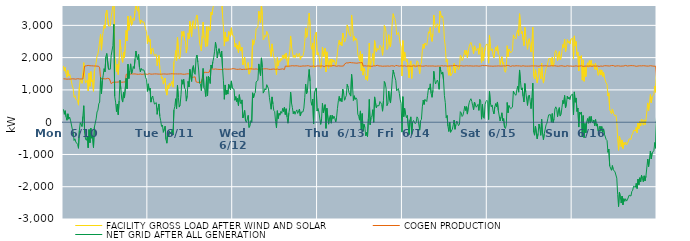
| Category | FACILITY GROSS LOAD AFTER WIND AND SOLAR | COGEN PRODUCTION | NET GRID AFTER ALL GENERATION |
|---|---|---|---|
|  Mon  6/10 | 1743 | 1344 | 399 |
|  Mon  6/10 | 1581 | 1337 | 244 |
|  Mon  6/10 | 1695 | 1340 | 355 |
|  Mon  6/10 | 1509 | 1345 | 164 |
|  Mon  6/10 | 1393 | 1333 | 60 |
|  Mon  6/10 | 1607 | 1347 | 260 |
|  Mon  6/10 | 1430 | 1336 | 94 |
|  Mon  6/10 | 1490 | 1333 | 157 |
|  Mon  6/10 | 1397 | 1335 | 62 |
|  Mon  6/10 | 1406 | 1343 | 63 |
|  Mon  6/10 | 1129 | 1344 | -215 |
|  Mon  6/10 | 1046 | 1338 | -292 |
|  Mon  6/10 | 771 | 1340 | -569 |
|  Mon  6/10 | 820 | 1335 | -515 |
|  Mon  6/10 | 718 | 1333 | -615 |
|  Mon  6/10 | 699 | 1342 | -643 |
|  Mon  6/10 | 663 | 1348 | -685 |
|  Mon  6/10 | 528 | 1337 | -809 |
|  Mon  6/10 | 1085 | 1340 | -255 |
|  Mon  6/10 | 1327 | 1341 | -14 |
|  Mon  6/10 | 1304 | 1339 | -35 |
|  Mon  6/10 | 1204 | 1339 | -135 |
|  Mon  6/10 | 1519 | 1339 | 180 |
|  Mon  6/10 | 1844 | 1334 | 510 |
|  Mon  6/10 | 1407 | 1738 | -331 |
|  Mon  6/10 | 1212 | 1740 | -528 |
|  Mon  6/10 | 1185 | 1747 | -562 |
|  Mon  6/10 | 1310 | 1741 | -431 |
|  Mon  6/10 | 966 | 1759 | -793 |
|  Mon  6/10 | 1524 | 1751 | -227 |
|  Mon  6/10 | 1111 | 1748 | -637 |
|  Mon  6/10 | 1568 | 1756 | -188 |
|  Mon  6/10 | 1251 | 1747 | -496 |
|  Mon  6/10 | 1310 | 1739 | -429 |
|  Mon  6/10 | 957 | 1743 | -786 |
|  Mon  6/10 | 1584 | 1738 | -154 |
|  Mon  6/10 | 1602 | 1740 | -138 |
|  Mon  6/10 | 1851 | 1749 | 102 |
|  Mon  6/10 | 2053 | 1737 | 316 |
|  Mon  6/10 | 2113 | 1739 | 374 |
|  Mon  6/10 | 2300 | 1730 | 570 |
|  Mon  6/10 | 2307 | 1683 | 624 |
|  Mon  6/10 | 2730 | 1346 | 1384 |
|  Mon  6/10 | 2231 | 1348 | 883 |
|  Mon  6/10 | 2627 | 1351 | 1276 |
|  Mon  6/10 | 2800 | 1343 | 1457 |
|  Mon  6/10 | 3002 | 1344 | 1658 |
|  Mon  6/10 | 2909 | 1346 | 1563 |
|  Mon  6/10 | 3368 | 1342 | 2026 |
|  Mon  6/10 | 3476 | 1347 | 2129 |
|  Mon  6/10 | 3496 | 1359 | 2137 |
|  Mon  6/10 | 2982 | 1343 | 1639 |
|  Mon  6/10 | 2984 | 1345 | 1639 |
|  Mon  6/10 | 2983 | 1340 | 1643 |
|  Mon  6/10 | 3257 | 1192 | 2065 |
|  Mon  6/10 | 3230 | 1183 | 2047 |
|  Mon  6/10 | 3615 | 1237 | 2378 |
|  Mon  6/10 | 4278 | 1244 | 3034 |
|  Mon  6/10 | 2042 | 1241 | 801 |
|  Mon  6/10 | 1866 | 1244 | 622 |
|  Mon  6/10 | 1567 | 1240 | 327 |
|  Mon  6/10 | 1799 | 1236 | 563 |
|  Mon  6/10 | 1475 | 1244 | 231 |
|  Mon  6/10 | 1906 | 1244 | 662 |
|  Mon  6/10 | 2555 | 1255 | 1300 |
|  Mon  6/10 | 2261 | 1244 | 1017 |
|  Mon  6/10 | 1950 | 1236 | 714 |
|  Mon  6/10 | 1854 | 1231 | 623 |
|  Mon  6/10 | 2165 | 1244 | 921 |
|  Mon  6/10 | 1989 | 1241 | 748 |
|  Mon  6/10 | 1975 | 1246 | 729 |
|  Mon  6/10 | 2842 | 1484 | 1358 |
|  Mon  6/10 | 2519 | 1486 | 1033 |
|  Mon  6/10 | 3290 | 1493 | 1797 |
|  Mon  6/10 | 2848 | 1498 | 1350 |
|  Mon  6/10 | 3084 | 1490 | 1594 |
|  Mon  6/10 | 3294 | 1486 | 1808 |
|  Mon  6/10 | 3003 | 1496 | 1507 |
|  Mon  6/10 | 3047 | 1477 | 1570 |
|  Mon  6/10 | 3220 | 1494 | 1726 |
|  Mon  6/10 | 3155 | 1492 | 1663 |
|  Mon  6/10 | 3449 | 1496 | 1953 |
|  Mon  6/10 | 3697 | 1491 | 2206 |
|  Mon  6/10 | 3503 | 1487 | 2016 |
|  Mon  6/10 | 3438 | 1498 | 1940 |
|  Mon  6/10 | 3581 | 1484 | 2097 |
|  Mon  6/10 | 3191 | 1494 | 1697 |
|  Mon  6/10 | 3052 | 1492 | 1560 |
|  Mon  6/10 | 3171 | 1508 | 1663 |
|  Mon  6/10 | 3099 | 1481 | 1618 |
|  Mon  6/10 | 3112 | 1490 | 1622 |
|  Mon  6/10 | 3109 | 1491 | 1618 |
|  Mon  6/10 | 3019 | 1491 | 1528 |
|  Mon  6/10 | 2870 | 1492 | 1378 |
|  Mon  6/10 | 2809 | 1480 | 1329 |
|  Mon  6/10 | 2434 | 1482 | 952 |
|  Tue  6/11 | 2679 | 1491 | 1188 |
|  Tue  6/11 | 2490 | 1503 | 987 |
|  Tue  6/11 | 2560 | 1501 | 1059 |
|  Tue  6/11 | 2109 | 1488 | 621 |
|  Tue  6/11 | 2267 | 1507 | 760 |
|  Tue  6/11 | 2301 | 1490 | 811 |
|  Tue  6/11 | 2158 | 1494 | 664 |
|  Tue  6/11 | 2056 | 1496 | 560 |
|  Tue  6/11 | 2084 | 1507 | 577 |
|  Tue  6/11 | 2102 | 1496 | 606 |
|  Tue  6/11 | 1750 | 1507 | 243 |
|  Tue  6/11 | 1935 | 1491 | 444 |
|  Tue  6/11 | 2069 | 1504 | 565 |
|  Tue  6/11 | 1674 | 1489 | 185 |
|  Tue  6/11 | 1534 | 1484 | 50 |
|  Tue  6/11 | 1357 | 1488 | -131 |
|  Tue  6/11 | 1402 | 1491 | -89 |
|  Tue  6/11 | 1180 | 1494 | -314 |
|  Tue  6/11 | 1280 | 1493 | -213 |
|  Tue  6/11 | 1369 | 1493 | -124 |
|  Tue  6/11 | 964 | 1501 | -537 |
|  Tue  6/11 | 837 | 1488 | -651 |
|  Tue  6/11 | 1141 | 1478 | -337 |
|  Tue  6/11 | 1042 | 1492 | -450 |
|  Tue  6/11 | 1214 | 1498 | -284 |
|  Tue  6/11 | 1131 | 1496 | -365 |
|  Tue  6/11 | 1149 | 1483 | -334 |
|  Tue  6/11 | 1269 | 1500 | -231 |
|  Tue  6/11 | 1086 | 1485 | -399 |
|  Tue  6/11 | 1871 | 1495 | 376 |
|  Tue  6/11 | 1978 | 1494 | 484 |
|  Tue  6/11 | 2223 | 1496 | 727 |
|  Tue  6/11 | 1897 | 1476 | 421 |
|  Tue  6/11 | 2637 | 1494 | 1143 |
|  Tue  6/11 | 2260 | 1487 | 773 |
|  Tue  6/11 | 1963 | 1495 | 468 |
|  Tue  6/11 | 2040 | 1499 | 541 |
|  Tue  6/11 | 2347 | 1497 | 850 |
|  Tue  6/11 | 2812 | 1496 | 1316 |
|  Tue  6/11 | 2664 | 1487 | 1177 |
|  Tue  6/11 | 2818 | 1489 | 1329 |
|  Tue  6/11 | 2546 | 1484 | 1062 |
|  Tue  6/11 | 2510 | 1492 | 1018 |
|  Tue  6/11 | 2146 | 1494 | 652 |
|  Tue  6/11 | 2327 | 1501 | 826 |
|  Tue  6/11 | 2764 | 1500 | 1264 |
|  Tue  6/11 | 2584 | 1492 | 1092 |
|  Tue  6/11 | 3130 | 1492 | 1638 |
|  Tue  6/11 | 3151 | 1493 | 1658 |
|  Tue  6/11 | 2653 | 1388 | 1265 |
|  Tue  6/11 | 3082 | 1405 | 1677 |
|  Tue  6/11 | 3147 | 1394 | 1753 |
|  Tue  6/11 | 2934 | 1400 | 1534 |
|  Tue  6/11 | 2887 | 1405 | 1482 |
|  Tue  6/11 | 3229 | 1250 | 1979 |
|  Tue  6/11 | 3322 | 1241 | 2081 |
|  Tue  6/11 | 3097 | 1233 | 1864 |
|  Tue  6/11 | 2854 | 1239 | 1615 |
|  Tue  6/11 | 2448 | 1237 | 1211 |
|  Tue  6/11 | 2423 | 1244 | 1179 |
|  Tue  6/11 | 2214 | 1237 | 977 |
|  Tue  6/11 | 2678 | 1346 | 1332 |
|  Tue  6/11 | 3103 | 1437 | 1666 |
|  Tue  6/11 | 2611 | 1545 | 1066 |
|  Tue  6/11 | 2546 | 1545 | 1001 |
|  Tue  6/11 | 2338 | 1544 | 794 |
|  Tue  6/11 | 2960 | 1554 | 1406 |
|  Tue  6/11 | 2357 | 1541 | 816 |
|  Tue  6/11 | 2959 | 1537 | 1422 |
|  Tue  6/11 | 2913 | 1550 | 1363 |
|  Tue  6/11 | 2839 | 1641 | 1198 |
|  Tue  6/11 | 3406 | 1635 | 1771 |
|  Tue  6/11 | 3328 | 1654 | 1674 |
|  Tue  6/11 | 3519 | 1647 | 1872 |
|  Tue  6/11 | 3638 | 1641 | 1997 |
|  Tue  6/11 | 3840 | 1641 | 2199 |
|  Tue  6/11 | 4129 | 1649 | 2480 |
|  Tue  6/11 | 3925 | 1638 | 2287 |
|  Tue  6/11 | 3629 | 1640 | 1989 |
|  Tue  6/11 | 3836 | 1642 | 2194 |
|  Tue  6/11 | 3915 | 1636 | 2279 |
|  Tue  6/11 | 3778 | 1642 | 2136 |
|  Tue  6/11 | 3650 | 1634 | 2016 |
|  Tue  6/11 | 3833 | 1630 | 2203 |
|  Tue  6/11 | 3303 | 1635 | 1668 |
|  Tue  6/11 | 2931 | 1649 | 1282 |
|  Tue  6/11 | 2358 | 1649 | 709 |
|  Tue  6/11 | 2795 | 1641 | 1154 |
|  Tue  6/11 | 2500 | 1643 | 857 |
|  Tue  6/11 | 2630 | 1641 | 989 |
|  Tue  6/11 | 2511 | 1641 | 870 |
|  Tue  6/11 | 2809 | 1639 | 1170 |
|  Tue  6/11 | 2829 | 1642 | 1187 |
|  Tue  6/11 | 2664 | 1654 | 1010 |
|  Tue  6/11 | 2926 | 1647 | 1279 |
|  Tue  6/11 | 2699 | 1647 | 1052 |
|  Wed  6/12 | 2701 | 1661 | 1040 |
|  Wed  6/12 | 2656 | 1636 | 1020 |
|  Wed  6/12 | 2328 | 1650 | 678 |
|  Wed  6/12 | 2438 | 1645 | 793 |
|  Wed  6/12 | 2276 | 1638 | 638 |
|  Wed  6/12 | 2387 | 1651 | 736 |
|  Wed  6/12 | 2153 | 1638 | 515 |
|  Wed  6/12 | 2496 | 1645 | 851 |
|  Wed  6/12 | 2284 | 1648 | 636 |
|  Wed  6/12 | 2201 | 1636 | 565 |
|  Wed  6/12 | 2323 | 1632 | 691 |
|  Wed  6/12 | 1777 | 1645 | 132 |
|  Wed  6/12 | 1875 | 1640 | 235 |
|  Wed  6/12 | 2016 | 1651 | 365 |
|  Wed  6/12 | 1680 | 1640 | 40 |
|  Wed  6/12 | 1632 | 1635 | -3 |
|  Wed  6/12 | 1745 | 1644 | 101 |
|  Wed  6/12 | 1848 | 1638 | 210 |
|  Wed  6/12 | 1486 | 1651 | -165 |
|  Wed  6/12 | 1537 | 1655 | -118 |
|  Wed  6/12 | 1701 | 1653 | 48 |
|  Wed  6/12 | 1639 | 1644 | -5 |
|  Wed  6/12 | 2557 | 1647 | 910 |
|  Wed  6/12 | 2388 | 1639 | 749 |
|  Wed  6/12 | 2522 | 1644 | 878 |
|  Wed  6/12 | 2564 | 1652 | 912 |
|  Wed  6/12 | 2896 | 1651 | 1245 |
|  Wed  6/12 | 2904 | 1649 | 1255 |
|  Wed  6/12 | 2940 | 1639 | 1301 |
|  Wed  6/12 | 3442 | 1637 | 1805 |
|  Wed  6/12 | 3421 | 1644 | 1777 |
|  Wed  6/12 | 3090 | 1645 | 1445 |
|  Wed  6/12 | 3634 | 1641 | 1993 |
|  Wed  6/12 | 3333 | 1634 | 1699 |
|  Wed  6/12 | 2551 | 1650 | 901 |
|  Wed  6/12 | 2599 | 1639 | 960 |
|  Wed  6/12 | 2694 | 1654 | 1040 |
|  Wed  6/12 | 2649 | 1651 | 998 |
|  Wed  6/12 | 2817 | 1654 | 1163 |
|  Wed  6/12 | 2824 | 1644 | 1180 |
|  Wed  6/12 | 2679 | 1643 | 1036 |
|  Wed  6/12 | 2399 | 1630 | 769 |
|  Wed  6/12 | 2410 | 1635 | 775 |
|  Wed  6/12 | 2031 | 1630 | 401 |
|  Wed  6/12 | 2426 | 1643 | 783 |
|  Wed  6/12 | 2200 | 1636 | 564 |
|  Wed  6/12 | 2008 | 1646 | 362 |
|  Wed  6/12 | 1966 | 1638 | 328 |
|  Wed  6/12 | 1653 | 1639 | 14 |
|  Wed  6/12 | 1469 | 1649 | -180 |
|  Wed  6/12 | 2003 | 1647 | 356 |
|  Wed  6/12 | 1745 | 1634 | 111 |
|  Wed  6/12 | 1909 | 1633 | 276 |
|  Wed  6/12 | 1862 | 1645 | 217 |
|  Wed  6/12 | 1979 | 1643 | 336 |
|  Wed  6/12 | 1917 | 1642 | 275 |
|  Wed  6/12 | 2076 | 1652 | 424 |
|  Wed  6/12 | 1980 | 1648 | 332 |
|  Wed  6/12 | 2093 | 1631 | 462 |
|  Wed  6/12 | 1973 | 1737 | 236 |
|  Wed  6/12 | 2142 | 1726 | 416 |
|  Wed  6/12 | 1896 | 1735 | 161 |
|  Wed  6/12 | 1706 | 1738 | -32 |
|  Wed  6/12 | 2018 | 1736 | 282 |
|  Wed  6/12 | 2194 | 1752 | 442 |
|  Wed  6/12 | 2671 | 1742 | 929 |
|  Wed  6/12 | 2333 | 1737 | 596 |
|  Wed  6/12 | 2201 | 1750 | 451 |
|  Wed  6/12 | 2009 | 1746 | 263 |
|  Wed  6/12 | 2081 | 1743 | 338 |
|  Wed  6/12 | 1995 | 1750 | 245 |
|  Wed  6/12 | 2077 | 1748 | 329 |
|  Wed  6/12 | 2131 | 1750 | 381 |
|  Wed  6/12 | 2016 | 1744 | 272 |
|  Wed  6/12 | 1989 | 1734 | 255 |
|  Wed  6/12 | 2141 | 1733 | 408 |
|  Wed  6/12 | 1942 | 1751 | 191 |
|  Wed  6/12 | 2048 | 1734 | 314 |
|  Wed  6/12 | 2017 | 1732 | 285 |
|  Wed  6/12 | 2061 | 1743 | 318 |
|  Wed  6/12 | 2175 | 1738 | 437 |
|  Wed  6/12 | 2498 | 1740 | 758 |
|  Wed  6/12 | 2919 | 1739 | 1180 |
|  Wed  6/12 | 2623 | 1746 | 877 |
|  Wed  6/12 | 2716 | 1747 | 969 |
|  Wed  6/12 | 3119 | 1751 | 1368 |
|  Wed  6/12 | 3382 | 1749 | 1633 |
|  Wed  6/12 | 2997 | 1733 | 1264 |
|  Wed  6/12 | 2362 | 1726 | 636 |
|  Wed  6/12 | 2259 | 1734 | 525 |
|  Wed  6/12 | 2455 | 1737 | 718 |
|  Wed  6/12 | 1686 | 1742 | -56 |
|  Wed  6/12 | 2660 | 1738 | 922 |
|  Wed  6/12 | 2667 | 1727 | 940 |
|  Wed  6/12 | 2790 | 1729 | 1061 |
|  Wed  6/12 | 2090 | 1745 | 345 |
|  Thu  6/13 | 2158 | 1736 | 422 |
|  Thu  6/13 | 2056 | 1740 | 316 |
|  Thu  6/13 | 2034 | 1748 | 286 |
|  Thu  6/13 | 1671 | 1739 | -68 |
|  Thu  6/13 | 1836 | 1734 | 102 |
|  Thu  6/13 | 2327 | 1744 | 583 |
|  Thu  6/13 | 2034 | 1741 | 293 |
|  Thu  6/13 | 2018 | 1723 | 295 |
|  Thu  6/13 | 2288 | 1745 | 543 |
|  Thu  6/13 | 1558 | 1749 | -191 |
|  Thu  6/13 | 2180 | 1745 | 435 |
|  Thu  6/13 | 2159 | 1743 | 416 |
|  Thu  6/13 | 1673 | 1734 | -61 |
|  Thu  6/13 | 1881 | 1740 | 141 |
|  Thu  6/13 | 1950 | 1740 | 210 |
|  Thu  6/13 | 1710 | 1741 | -31 |
|  Thu  6/13 | 1956 | 1743 | 213 |
|  Thu  6/13 | 1861 | 1753 | 108 |
|  Thu  6/13 | 1928 | 1739 | 189 |
|  Thu  6/13 | 1862 | 1749 | 113 |
|  Thu  6/13 | 1754 | 1747 | 7 |
|  Thu  6/13 | 1882 | 1732 | 150 |
|  Thu  6/13 | 2176 | 1747 | 429 |
|  Thu  6/13 | 2410 | 1747 | 663 |
|  Thu  6/13 | 2539 | 1740 | 799 |
|  Thu  6/13 | 2390 | 1739 | 651 |
|  Thu  6/13 | 2484 | 1743 | 741 |
|  Thu  6/13 | 2371 | 1737 | 634 |
|  Thu  6/13 | 2763 | 1743 | 1020 |
|  Thu  6/13 | 2626 | 1743 | 883 |
|  Thu  6/13 | 2482 | 1801 | 681 |
|  Thu  6/13 | 2565 | 1797 | 768 |
|  Thu  6/13 | 2658 | 1838 | 820 |
|  Thu  6/13 | 3013 | 1841 | 1172 |
|  Thu  6/13 | 2921 | 1835 | 1086 |
|  Thu  6/13 | 2760 | 1842 | 918 |
|  Thu  6/13 | 2763 | 1851 | 912 |
|  Thu  6/13 | 2659 | 1851 | 808 |
|  Thu  6/13 | 3322 | 1842 | 1480 |
|  Thu  6/13 | 3009 | 1854 | 1155 |
|  Thu  6/13 | 2510 | 1839 | 671 |
|  Thu  6/13 | 2660 | 1841 | 819 |
|  Thu  6/13 | 2536 | 1832 | 704 |
|  Thu  6/13 | 2602 | 1847 | 755 |
|  Thu  6/13 | 2530 | 1828 | 702 |
|  Thu  6/13 | 2100 | 1852 | 248 |
|  Thu  6/13 | 2024 | 1838 | 186 |
|  Thu  6/13 | 1898 | 1836 | 62 |
|  Thu  6/13 | 2192 | 1843 | 349 |
|  Thu  6/13 | 1593 | 1839 | -246 |
|  Thu  6/13 | 2114 | 1847 | 267 |
|  Thu  6/13 | 1458 | 1739 | -281 |
|  Thu  6/13 | 1678 | 1744 | -66 |
|  Thu  6/13 | 1584 | 1747 | -163 |
|  Thu  6/13 | 1323 | 1747 | -424 |
|  Thu  6/13 | 1424 | 1740 | -316 |
|  Thu  6/13 | 1295 | 1741 | -446 |
|  Thu  6/13 | 1861 | 1743 | 118 |
|  Thu  6/13 | 2453 | 1747 | 706 |
|  Thu  6/13 | 1658 | 1736 | -78 |
|  Thu  6/13 | 1879 | 1731 | 148 |
|  Thu  6/13 | 1920 | 1731 | 189 |
|  Thu  6/13 | 2125 | 1738 | 387 |
|  Thu  6/13 | 1741 | 1745 | -4 |
|  Thu  6/13 | 2527 | 1744 | 783 |
|  Thu  6/13 | 2507 | 1745 | 762 |
|  Thu  6/13 | 2190 | 1744 | 446 |
|  Thu  6/13 | 2275 | 1764 | 511 |
|  Thu  6/13 | 2270 | 1752 | 518 |
|  Thu  6/13 | 2253 | 1742 | 511 |
|  Thu  6/13 | 2385 | 1745 | 640 |
|  Thu  6/13 | 2344 | 1742 | 602 |
|  Thu  6/13 | 2290 | 1744 | 546 |
|  Thu  6/13 | 2073 | 1733 | 340 |
|  Thu  6/13 | 2402 | 1743 | 659 |
|  Thu  6/13 | 2997 | 1737 | 1260 |
|  Thu  6/13 | 2925 | 1730 | 1195 |
|  Thu  6/13 | 2790 | 1737 | 1053 |
|  Thu  6/13 | 2255 | 1741 | 514 |
|  Thu  6/13 | 2324 | 1742 | 582 |
|  Thu  6/13 | 2710 | 1745 | 965 |
|  Thu  6/13 | 2415 | 1734 | 681 |
|  Thu  6/13 | 2330 | 1737 | 593 |
|  Thu  6/13 | 2681 | 1747 | 934 |
|  Thu  6/13 | 3073 | 1739 | 1334 |
|  Thu  6/13 | 3361 | 1744 | 1617 |
|  Thu  6/13 | 3248 | 1751 | 1497 |
|  Thu  6/13 | 3196 | 1729 | 1467 |
|  Thu  6/13 | 3048 | 1760 | 1288 |
|  Thu  6/13 | 2708 | 1737 | 971 |
|  Thu  6/13 | 2746 | 1749 | 997 |
|  Thu  6/13 | 2778 | 1737 | 1041 |
|  Thu  6/13 | 2627 | 1735 | 892 |
|  Thu  6/13 | 2438 | 1745 | 693 |
|  Thu  6/13 | 2334 | 1749 | 585 |
|  Thu  6/13 | 1430 | 1738 | -308 |
|  Fri  6/14 | 2528 | 1738 | 790 |
|  Fri  6/14 | 1914 | 1743 | 171 |
|  Fri  6/14 | 2176 | 1747 | 429 |
|  Fri  6/14 | 2005 | 1751 | 254 |
|  Fri  6/14 | 1871 | 1733 | 138 |
|  Fri  6/14 | 1948 | 1739 | 209 |
|  Fri  6/14 | 1922 | 1742 | 180 |
|  Fri  6/14 | 1377 | 1760 | -383 |
|  Fri  6/14 | 1801 | 1738 | 63 |
|  Fri  6/14 | 1899 | 1734 | 165 |
|  Fri  6/14 | 1356 | 1733 | -377 |
|  Fri  6/14 | 1744 | 1745 | -1 |
|  Fri  6/14 | 1802 | 1748 | 54 |
|  Fri  6/14 | 1770 | 1741 | 29 |
|  Fri  6/14 | 1690 | 1737 | -47 |
|  Fri  6/14 | 1742 | 1752 | -10 |
|  Fri  6/14 | 1903 | 1738 | 165 |
|  Fri  6/14 | 1868 | 1751 | 117 |
|  Fri  6/14 | 1851 | 1749 | 102 |
|  Fri  6/14 | 1504 | 1751 | -247 |
|  Fri  6/14 | 1787 | 1743 | 44 |
|  Fri  6/14 | 1832 | 1747 | 85 |
|  Fri  6/14 | 2210 | 1735 | 475 |
|  Fri  6/14 | 2419 | 1736 | 683 |
|  Fri  6/14 | 2286 | 1737 | 549 |
|  Fri  6/14 | 2454 | 1752 | 702 |
|  Fri  6/14 | 2447 | 1750 | 697 |
|  Fri  6/14 | 2382 | 1741 | 641 |
|  Fri  6/14 | 2573 | 1739 | 834 |
|  Fri  6/14 | 2802 | 1742 | 1060 |
|  Fri  6/14 | 2757 | 1741 | 1016 |
|  Fri  6/14 | 2936 | 1748 | 1188 |
|  Fri  6/14 | 2628 | 1740 | 888 |
|  Fri  6/14 | 2503 | 1732 | 771 |
|  Fri  6/14 | 2732 | 1743 | 989 |
|  Fri  6/14 | 3322 | 1745 | 1577 |
|  Fri  6/14 | 3057 | 1735 | 1322 |
|  Fri  6/14 | 2928 | 1745 | 1183 |
|  Fri  6/14 | 2995 | 1736 | 1259 |
|  Fri  6/14 | 3050 | 1746 | 1304 |
|  Fri  6/14 | 2964 | 1742 | 1222 |
|  Fri  6/14 | 2775 | 1756 | 1019 |
|  Fri  6/14 | 3445 | 1735 | 1710 |
|  Fri  6/14 | 3332 | 1753 | 1579 |
|  Fri  6/14 | 3240 | 1752 | 1488 |
|  Fri  6/14 | 3293 | 1737 | 1556 |
|  Fri  6/14 | 3045 | 1739 | 1306 |
|  Fri  6/14 | 2561 | 1741 | 820 |
|  Fri  6/14 | 2350 | 1746 | 604 |
|  Fri  6/14 | 1873 | 1730 | 143 |
|  Fri  6/14 | 1942 | 1737 | 205 |
|  Fri  6/14 | 1615 | 1739 | -124 |
|  Fri  6/14 | 1451 | 1740 | -289 |
|  Fri  6/14 | 1729 | 1726 | 3 |
|  Fri  6/14 | 1431 | 1745 | -314 |
|  Fri  6/14 | 1411 | 1755 | -344 |
|  Fri  6/14 | 1531 | 1745 | -214 |
|  Fri  6/14 | 1655 | 1738 | -83 |
|  Fri  6/14 | 1823 | 1756 | 67 |
|  Fri  6/14 | 1523 | 1743 | -220 |
|  Fri  6/14 | 1685 | 1758 | -73 |
|  Fri  6/14 | 1766 | 1733 | 33 |
|  Fri  6/14 | 1770 | 1738 | 32 |
|  Fri  6/14 | 1625 | 1733 | -108 |
|  Fri  6/14 | 1671 | 1740 | -69 |
|  Fri  6/14 | 2075 | 1749 | 326 |
|  Fri  6/14 | 2038 | 1750 | 288 |
|  Fri  6/14 | 1909 | 1732 | 177 |
|  Fri  6/14 | 1955 | 1739 | 216 |
|  Fri  6/14 | 2080 | 1743 | 337 |
|  Fri  6/14 | 2234 | 1741 | 493 |
|  Fri  6/14 | 2096 | 1731 | 365 |
|  Fri  6/14 | 2230 | 1749 | 481 |
|  Fri  6/14 | 1997 | 1746 | 251 |
|  Fri  6/14 | 2206 | 1742 | 464 |
|  Fri  6/14 | 2337 | 1736 | 601 |
|  Fri  6/14 | 2424 | 1745 | 679 |
|  Fri  6/14 | 2475 | 1748 | 727 |
|  Fri  6/14 | 2381 | 1741 | 640 |
|  Fri  6/14 | 2252 | 1745 | 507 |
|  Fri  6/14 | 2121 | 1737 | 384 |
|  Fri  6/14 | 2365 | 1741 | 624 |
|  Fri  6/14 | 2280 | 1743 | 537 |
|  Fri  6/14 | 2215 | 1752 | 463 |
|  Fri  6/14 | 2200 | 1743 | 457 |
|  Fri  6/14 | 2292 | 1740 | 552 |
|  Fri  6/14 | 2101 | 1736 | 365 |
|  Fri  6/14 | 2440 | 1734 | 706 |
|  Fri  6/14 | 2405 | 1742 | 663 |
|  Fri  6/14 | 1843 | 1750 | 93 |
|  Fri  6/14 | 2307 | 1757 | 550 |
|  Fri  6/14 | 1894 | 1741 | 153 |
|  Fri  6/14 | 1868 | 1750 | 118 |
|  Fri  6/14 | 2302 | 1748 | 554 |
|  Fri  6/14 | 2391 | 1754 | 637 |
|  Fri  6/14 | 2425 | 1749 | 676 |
|  Sat  6/15 | 2381 | 1744 | 637 |
|  Sat  6/15 | 1828 | 1746 | 82 |
|  Sat  6/15 | 2689 | 1739 | 950 |
|  Sat  6/15 | 2347 | 1744 | 603 |
|  Sat  6/15 | 2214 | 1738 | 476 |
|  Sat  6/15 | 2274 | 1741 | 533 |
|  Sat  6/15 | 2084 | 1734 | 350 |
|  Sat  6/15 | 1995 | 1739 | 256 |
|  Sat  6/15 | 2211 | 1739 | 472 |
|  Sat  6/15 | 2328 | 1753 | 575 |
|  Sat  6/15 | 2209 | 1739 | 470 |
|  Sat  6/15 | 2366 | 1740 | 626 |
|  Sat  6/15 | 2101 | 1744 | 357 |
|  Sat  6/15 | 2068 | 1741 | 327 |
|  Sat  6/15 | 1780 | 1740 | 40 |
|  Sat  6/15 | 1895 | 1739 | 156 |
|  Sat  6/15 | 2030 | 1739 | 291 |
|  Sat  6/15 | 1795 | 1752 | 43 |
|  Sat  6/15 | 1855 | 1744 | 111 |
|  Sat  6/15 | 1592 | 1753 | -161 |
|  Sat  6/15 | 1546 | 1741 | -195 |
|  Sat  6/15 | 1662 | 1749 | -87 |
|  Sat  6/15 | 2369 | 1759 | 610 |
|  Sat  6/15 | 2032 | 1740 | 292 |
|  Sat  6/15 | 2267 | 1750 | 517 |
|  Sat  6/15 | 2203 | 1738 | 465 |
|  Sat  6/15 | 2147 | 1728 | 419 |
|  Sat  6/15 | 2151 | 1754 | 397 |
|  Sat  6/15 | 2215 | 1748 | 467 |
|  Sat  6/15 | 2705 | 1743 | 962 |
|  Sat  6/15 | 2623 | 1739 | 884 |
|  Sat  6/15 | 2644 | 1742 | 902 |
|  Sat  6/15 | 2581 | 1748 | 833 |
|  Sat  6/15 | 2774 | 1757 | 1017 |
|  Sat  6/15 | 2859 | 1745 | 1114 |
|  Sat  6/15 | 2675 | 1745 | 930 |
|  Sat  6/15 | 3361 | 1743 | 1618 |
|  Sat  6/15 | 3047 | 1756 | 1291 |
|  Sat  6/15 | 2735 | 1735 | 1000 |
|  Sat  6/15 | 2810 | 1747 | 1063 |
|  Sat  6/15 | 2549 | 1749 | 800 |
|  Sat  6/15 | 2369 | 1744 | 625 |
|  Sat  6/15 | 2935 | 1737 | 1198 |
|  Sat  6/15 | 2678 | 1742 | 936 |
|  Sat  6/15 | 2671 | 1737 | 934 |
|  Sat  6/15 | 2259 | 1741 | 518 |
|  Sat  6/15 | 2541 | 1737 | 804 |
|  Sat  6/15 | 2593 | 1751 | 842 |
|  Sat  6/15 | 2391 | 1739 | 652 |
|  Sat  6/15 | 2173 | 1753 | 420 |
|  Sat  6/15 | 2497 | 1744 | 753 |
|  Sat  6/15 | 2947 | 1737 | 1210 |
|  Sat  6/15 | 1435 | 1743 | -308 |
|  Sat  6/15 | 1336 | 1740 | -404 |
|  Sat  6/15 | 1624 | 1744 | -120 |
|  Sat  6/15 | 1651 | 1749 | -98 |
|  Sat  6/15 | 1222 | 1738 | -516 |
|  Sat  6/15 | 1397 | 1743 | -346 |
|  Sat  6/15 | 1678 | 1734 | -56 |
|  Sat  6/15 | 1530 | 1731 | -201 |
|  Sat  6/15 | 1343 | 1751 | -408 |
|  Sat  6/15 | 1833 | 1742 | 91 |
|  Sat  6/15 | 1360 | 1742 | -382 |
|  Sat  6/15 | 1211 | 1754 | -543 |
|  Sat  6/15 | 1393 | 1745 | -352 |
|  Sat  6/15 | 1372 | 1748 | -376 |
|  Sat  6/15 | 1666 | 1748 | -82 |
|  Sat  6/15 | 1719 | 1748 | -29 |
|  Sat  6/15 | 1850 | 1738 | 112 |
|  Sat  6/15 | 1968 | 1741 | 227 |
|  Sat  6/15 | 1950 | 1740 | 210 |
|  Sat  6/15 | 1972 | 1739 | 233 |
|  Sat  6/15 | 1745 | 1748 | -3 |
|  Sat  6/15 | 2009 | 1743 | 266 |
|  Sat  6/15 | 1733 | 1745 | -12 |
|  Sat  6/15 | 1840 | 1737 | 103 |
|  Sat  6/15 | 2158 | 1748 | 410 |
|  Sat  6/15 | 2221 | 1745 | 476 |
|  Sat  6/15 | 2139 | 1738 | 401 |
|  Sat  6/15 | 1903 | 1737 | 166 |
|  Sat  6/15 | 2108 | 1734 | 374 |
|  Sat  6/15 | 2192 | 1740 | 452 |
|  Sat  6/15 | 1933 | 1744 | 189 |
|  Sat  6/15 | 1989 | 1742 | 247 |
|  Sat  6/15 | 2211 | 1748 | 463 |
|  Sat  6/15 | 2407 | 1732 | 675 |
|  Sat  6/15 | 2313 | 1735 | 578 |
|  Sat  6/15 | 2563 | 1736 | 827 |
|  Sat  6/15 | 2174 | 1731 | 443 |
|  Sat  6/15 | 2306 | 1748 | 558 |
|  Sat  6/15 | 2560 | 1750 | 810 |
|  Sat  6/15 | 2457 | 1739 | 718 |
|  Sat  6/15 | 2519 | 1737 | 782 |
|  Sat  6/15 | 2421 | 1722 | 699 |
|  Sat  6/15 | 2566 | 1740 | 826 |
|  Sat  6/15 | 2552 | 1743 | 809 |
|  Sun  6/16 | 2605 | 1733 | 872 |
|  Sun  6/16 | 1961 | 1736 | 225 |
|  Sun  6/16 | 2674 | 1736 | 938 |
|  Sun  6/16 | 2359 | 1741 | 618 |
|  Sun  6/16 | 2497 | 1746 | 751 |
|  Sun  6/16 | 2075 | 1744 | 331 |
|  Sun  6/16 | 2171 | 1733 | 438 |
|  Sun  6/16 | 1591 | 1742 | -151 |
|  Sun  6/16 | 2050 | 1739 | 311 |
|  Sun  6/16 | 1981 | 1734 | 247 |
|  Sun  6/16 | 2063 | 1747 | 316 |
|  Sun  6/16 | 1304 | 1759 | -455 |
|  Sun  6/16 | 1933 | 1727 | 206 |
|  Sun  6/16 | 1267 | 1744 | -477 |
|  Sun  6/16 | 1699 | 1738 | -39 |
|  Sun  6/16 | 1415 | 1745 | -330 |
|  Sun  6/16 | 1747 | 1737 | 10 |
|  Sun  6/16 | 1838 | 1725 | 113 |
|  Sun  6/16 | 1705 | 1737 | -32 |
|  Sun  6/16 | 1905 | 1736 | 169 |
|  Sun  6/16 | 1715 | 1742 | -27 |
|  Sun  6/16 | 1913 | 1735 | 178 |
|  Sun  6/16 | 1741 | 1730 | 11 |
|  Sun  6/16 | 1719 | 1743 | -24 |
|  Sun  6/16 | 1809 | 1742 | 67 |
|  Sun  6/16 | 1638 | 1750 | -112 |
|  Sun  6/16 | 1819 | 1737 | 82 |
|  Sun  6/16 | 1616 | 1737 | -121 |
|  Sun  6/16 | 1688 | 1741 | -53 |
|  Sun  6/16 | 1452 | 1731 | -279 |
|  Sun  6/16 | 1497 | 1729 | -232 |
|  Sun  6/16 | 1633 | 1755 | -122 |
|  Sun  6/16 | 1459 | 1740 | -281 |
|  Sun  6/16 | 1612 | 1747 | -135 |
|  Sun  6/16 | 1419 | 1733 | -314 |
|  Sun  6/16 | 1548 | 1755 | -207 |
|  Sun  6/16 | 1379 | 1749 | -370 |
|  Sun  6/16 | 1382 | 1751 | -369 |
|  Sun  6/16 | 1213 | 1749 | -536 |
|  Sun  6/16 | 1165 | 1737 | -572 |
|  Sun  6/16 | 810 | 1743 | -933 |
|  Sun  6/16 | 908 | 1742 | -834 |
|  Sun  6/16 | 383 | 1740 | -1357 |
|  Sun  6/16 | 366 | 1740 | -1374 |
|  Sun  6/16 | 262 | 1754 | -1492 |
|  Sun  6/16 | 410 | 1753 | -1343 |
|  Sun  6/16 | 283 | 1755 | -1472 |
|  Sun  6/16 | 294 | 1746 | -1452 |
|  Sun  6/16 | 193 | 1733 | -1540 |
|  Sun  6/16 | 225 | 1747 | -1522 |
|  Sun  6/16 | 11 | 1745 | -1734 |
|  Sun  6/16 | -494 | 1742 | -2236 |
|  Sun  6/16 | -870 | 1746 | -2616 |
|  Sun  6/16 | -429 | 1737 | -2166 |
|  Sun  6/16 | -575 | 1736 | -2311 |
|  Sun  6/16 | -760 | 1746 | -2506 |
|  Sun  6/16 | -551 | 1739 | -2290 |
|  Sun  6/16 | -816 | 1745 | -2561 |
|  Sun  6/16 | -630 | 1741 | -2371 |
|  Sun  6/16 | -700 | 1752 | -2452 |
|  Sun  6/16 | -614 | 1759 | -2373 |
|  Sun  6/16 | -703 | 1742 | -2445 |
|  Sun  6/16 | -665 | 1740 | -2405 |
|  Sun  6/16 | -664 | 1744 | -2408 |
|  Sun  6/16 | -515 | 1747 | -2262 |
|  Sun  6/16 | -515 | 1751 | -2266 |
|  Sun  6/16 | -535 | 1753 | -2288 |
|  Sun  6/16 | -398 | 1751 | -2149 |
|  Sun  6/16 | -358 | 1751 | -2109 |
|  Sun  6/16 | -248 | 1737 | -1985 |
|  Sun  6/16 | -257 | 1746 | -2003 |
|  Sun  6/16 | -274 | 1744 | -2018 |
|  Sun  6/16 | -164 | 1731 | -1895 |
|  Sun  6/16 | -328 | 1729 | -2057 |
|  Sun  6/16 | -25 | 1740 | -1765 |
|  Sun  6/16 | -208 | 1732 | -1940 |
|  Sun  6/16 | 26 | 1747 | -1721 |
|  Sun  6/16 | -117 | 1733 | -1850 |
|  Sun  6/16 | 98 | 1744 | -1646 |
|  Sun  6/16 | 9 | 1753 | -1744 |
|  Sun  6/16 | -94 | 1750 | -1844 |
|  Sun  6/16 | 72 | 1733 | -1661 |
|  Sun  6/16 | -75 | 1745 | -1820 |
|  Sun  6/16 | 67 | 1738 | -1671 |
|  Sun  6/16 | 46 | 1738 | -1692 |
|  Sun  6/16 | 597 | 1738 | -1141 |
|  Sun  6/16 | 360 | 1738 | -1378 |
|  Sun  6/16 | 594 | 1734 | -1140 |
|  Sun  6/16 | 857 | 1750 | -893 |
|  Sun  6/16 | 604 | 1743 | -1139 |
|  Sun  6/16 | 789 | 1742 | -953 |
|  Sun  6/16 | 812 | 1749 | -937 |
|  Sun  6/16 | 862 | 1735 | -873 |
|  Sun  6/16 | 1121 | 1752 | -631 |
|  Sun  6/16 | 926 | 1734 | -808 |
|  Sun  6/9 | 1562 | 1353 | 209 |